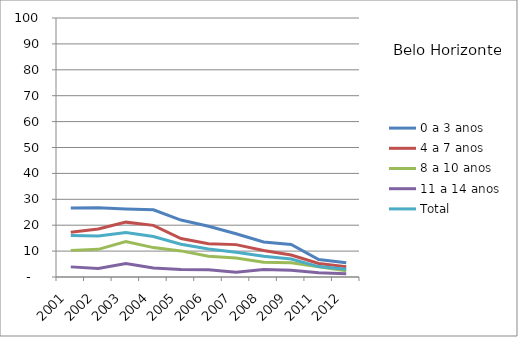
| Category | 0 a 3 anos | 4 a 7 anos | 8 a 10 anos | 11 a 14 anos | Total |
|---|---|---|---|---|---|
| 2001.0 | 26.68 | 17.3 | 10.28 | 3.91 | 16.04 |
| 2002.0 | 26.74 | 18.56 | 10.68 | 3.28 | 15.86 |
| 2003.0 | 26.3 | 21.18 | 13.71 | 5.17 | 17.15 |
| 2004.0 | 25.93 | 19.93 | 11.35 | 3.47 | 15.66 |
| 2005.0 | 21.98 | 14.87 | 10.08 | 2.88 | 12.63 |
| 2006.0 | 19.6 | 12.83 | 7.99 | 2.79 | 10.81 |
| 2007.0 | 16.72 | 12.5 | 7.31 | 1.83 | 9.55 |
| 2008.0 | 13.55 | 10.25 | 5.69 | 2.85 | 7.97 |
| 2009.0 | 12.58 | 8.49 | 5.48 | 2.65 | 6.93 |
| 2011.0 | 6.72 | 5.25 | 3.96 | 1.64 | 4.02 |
| 2012.0 | 5.5 | 3.96 | 2.44 | 1.21 | 3.02 |